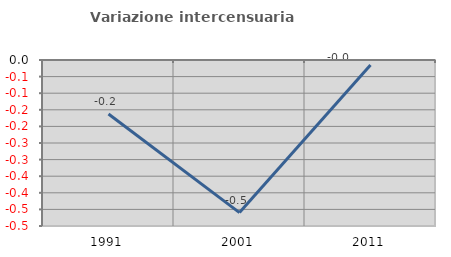
| Category | Variazione intercensuaria annua |
|---|---|
| 1991.0 | -0.163 |
| 2001.0 | -0.46 |
| 2011.0 | -0.015 |